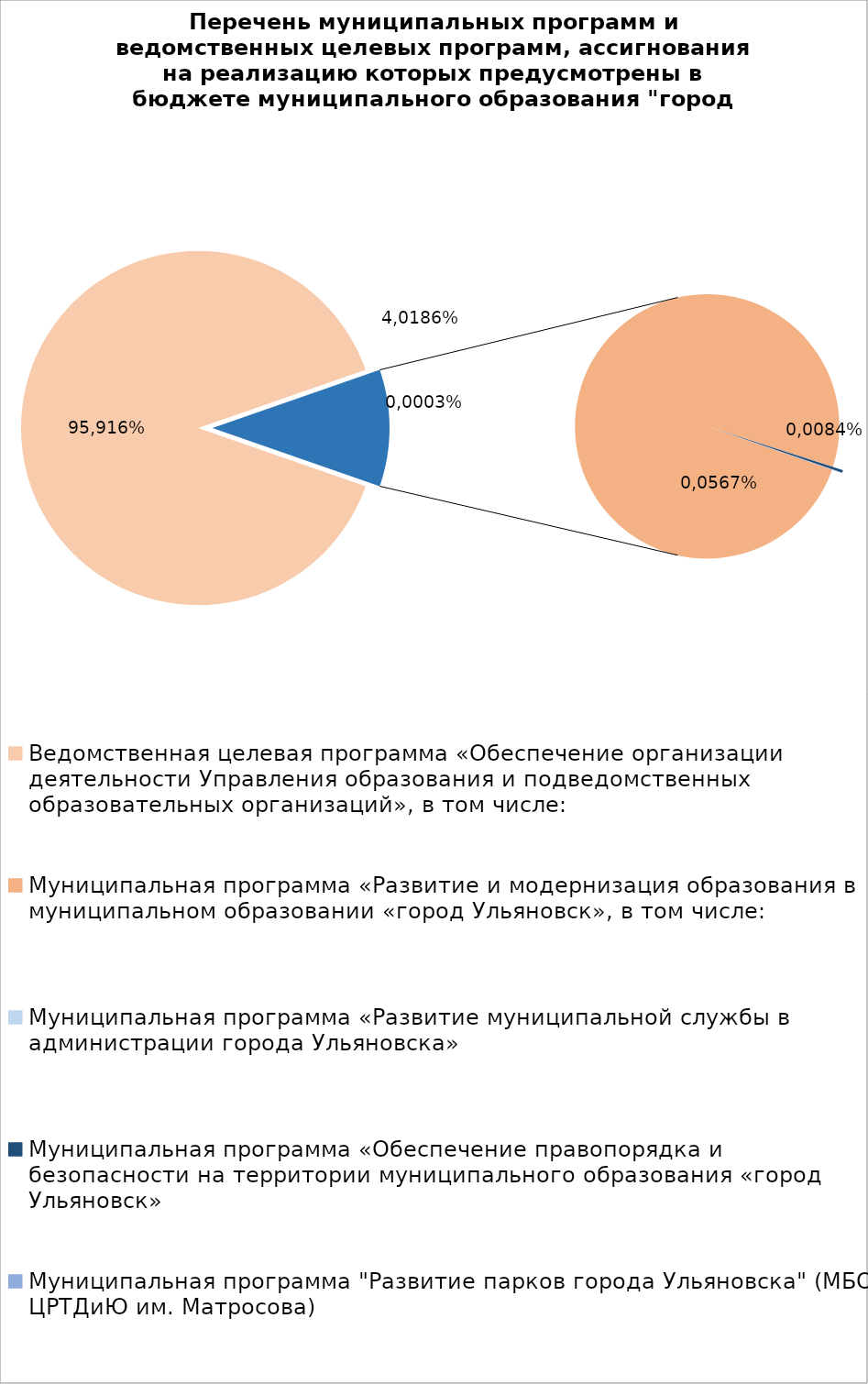
| Category | Series 0 |
|---|---|
| Ведомственная целевая программа «Обеспечение организации деятельности Управления образования и подведомственных образовательных организаций», в том числе: | 7042325.32 |
| Муниципальная программа «Развитие и модернизация образования в муниципальном образовании «город Ульяновск», в том числе: | 836410.63 |
| Муниципальная программа «Развитие муниципальной службы в администрации города Ульяновска» | 14.3 |
| Муниципальная программа «Обеспечение правопорядка и безопасности на территории муниципального образования «город Ульяновск» | 2700 |
| Муниципальная программа "Развитие парков города Ульяновска" (МБОУ ЦРТДиЮ им. Матросова) | 400 |